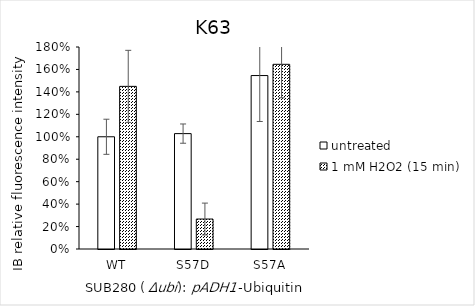
| Category | untreated | 1 mM H2O2 (15 min) |
|---|---|---|
| WT | 1 | 1.449 |
| S57D | 1.028 | 0.267 |
| S57A | 1.546 | 1.646 |